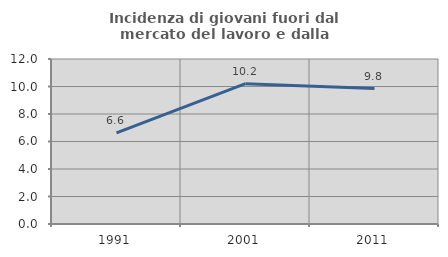
| Category | Incidenza di giovani fuori dal mercato del lavoro e dalla formazione  |
|---|---|
| 1991.0 | 6.627 |
| 2001.0 | 10.204 |
| 2011.0 | 9.848 |